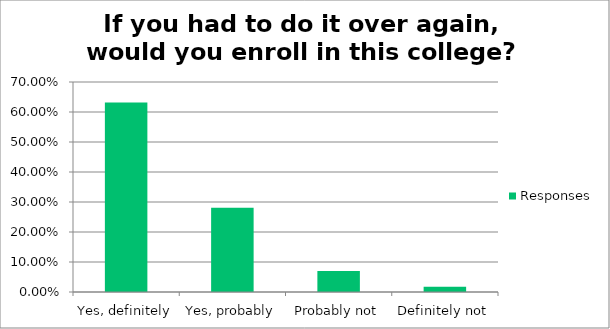
| Category | Responses |
|---|---|
| Yes, definitely | 0.632 |
| Yes, probably | 0.281 |
| Probably not | 0.07 |
| Definitely not | 0.018 |